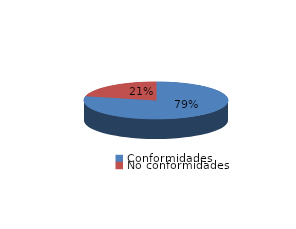
| Category | Series 0 |
|---|---|
| Conformidades | 1385 |
| No conformidades | 377 |